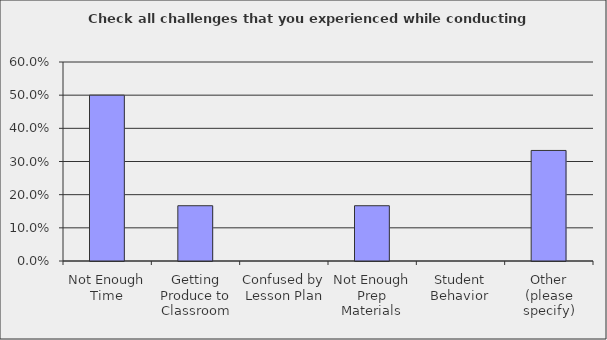
| Category | Series 0 |
|---|---|
| Not Enough Time | 0.5 |
| Getting Produce to Classroom | 0.167 |
| Confused by Lesson Plan | 0 |
| Not Enough Prep Materials | 0.167 |
| Student Behavior | 0 |
| Other (please specify) | 0.333 |